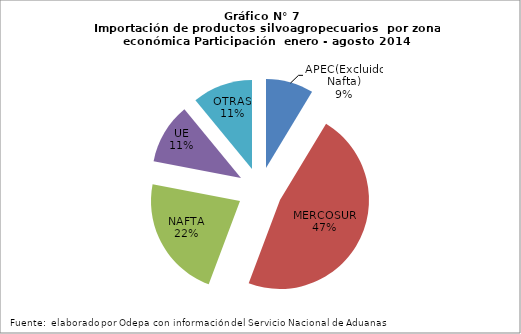
| Category | Series 0 |
|---|---|
| APEC(Excluido Nafta) | 314203.517 |
| MERCOSUR | 1707743.749 |
| NAFTA | 809299.519 |
| UE | 399504.865 |
| OTRAS | 397973.35 |